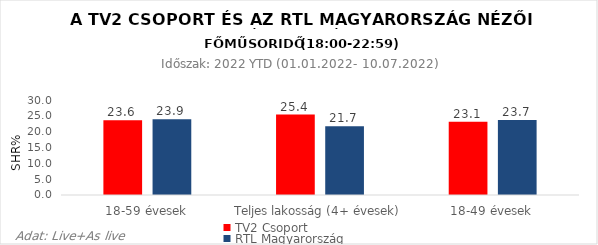
| Category | TV2 Csoport | RTL Magyarország |
|---|---|---|
| 18-59 évesek | 23.6 | 23.9 |
| Teljes lakosság (4+ évesek) | 25.4 | 21.7 |
| 18-49 évesek | 23.1 | 23.7 |